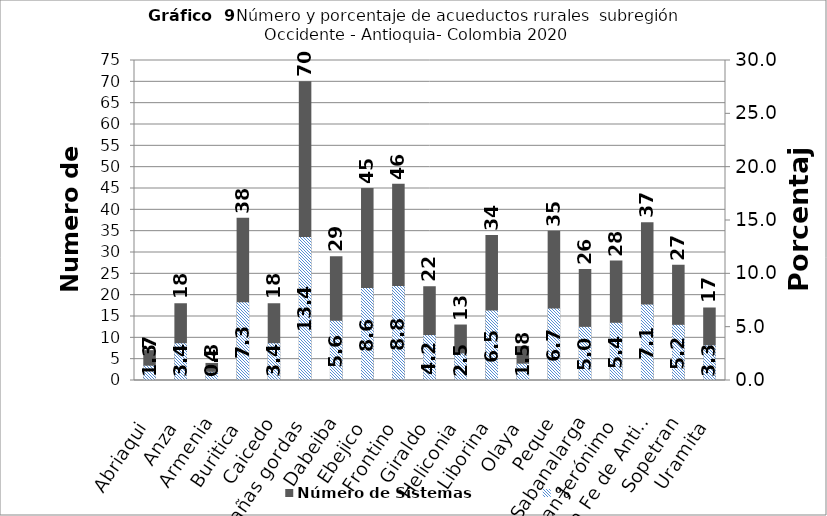
| Category | Número de Sistemas |
|---|---|
| Abriaqui | 7 |
| Anza | 18 |
| Armenia | 4 |
| Buritica | 38 |
| Caicedo | 18 |
| Cañas gordas | 70 |
| Dabeiba | 29 |
| Ebejico | 45 |
| Frontino | 46 |
| Giraldo | 22 |
| Heliconia | 13 |
| Liborina | 34 |
| Olaya | 8 |
| Peque | 35 |
| Sabanalarga | 26 |
| San Jerónimo | 28 |
| Santa Fe de Antioquia | 37 |
| Sopetran | 27 |
| Uramita | 17 |